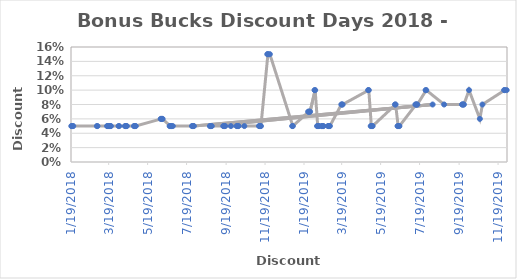
| Category | Discount |
|---|---|
| 12/2/19 | 0.1 |
| 11/29/19 | 0.1 |
| 11/28/19 | 0.1 |
| 10/25/19 | 0.08 |
| 10/21/19 | 0.06 |
| 10/4/19 | 0.1 |
| 9/26/19 | 0.08 |
| 9/25/19 | 0.08 |
| 9/24/19 | 0.08 |
| 9/23/19 | 0.08 |
| 8/26/19 | 0.08 |
| 7/29/19 | 0.1 |
| 7/28/19 | 0.1 |
| 7/15/19 | 0.08 |
| 7/14/19 | 0.08 |
| 7/13/19 | 0.08 |
| 7/12/19 | 0.08 |
| 6/17/19 | 0.05 |
| 6/16/19 | 0.05 |
| 6/15/19 | 0.05 |
| 6/14/19 | 0.05 |
| 6/11/19 | 0.08 |
| 6/10/19 | 0.08 |
| 5/6/19 | 0.05 |
| 5/5/19 | 0.05 |
| 5/4/19 | 0.05 |
| 5/3/19 | 0.05 |
| 4/30/19 | 0.1 |
| 4/29/19 | 0.1 |
| 3/20/19 | 0.08 |
| 3/19/19 | 0.08 |
| 3/18/19 | 0.08 |
| 2/28/19 | 0.05 |
| 2/27/19 | 0.05 |
| 2/26/19 | 0.05 |
| 2/25/19 | 0.05 |
| 2/18/19 | 0.05 |
| 2/17/19 | 0.05 |
| 2/16/19 | 0.05 |
| 2/15/19 | 0.05 |
| 2/11/19 | 0.05 |
| 2/10/19 | 0.05 |
| 2/9/19 | 0.05 |
| 2/8/19 | 0.05 |
| 2/5/19 | 0.1 |
| 2/4/19 | 0.1 |
| 1/28/19 | 0.07 |
| 1/27/19 | 0.07 |
| 1/26/19 | 0.07 |
| 1/25/19 | 0.07 |
| 1/1/19 | 0.05 |
| 12/31/18 | 0.05 |
| 11/26/18 | 0.15 |
| 11/23/18 | 0.15 |
| 11/22/18 | 0.15 |
| 11/12/18 | 0.05 |
| 11/11/18 | 0.05 |
| 11/10/18 | 0.05 |
| 11/9/18 | 0.05 |
| 10/17/18 | 0.05 |
| 10/8/18 | 0.05 |
| 10/7/18 | 0.05 |
| 10/6/18 | 0.05 |
| 10/5/18 | 0.05 |
| 9/26/18 | 0.05 |
| 9/17/18 | 0.05 |
| 9/16/18 | 0.05 |
| 9/15/18 | 0.05 |
| 9/14/18 | 0.05 |
| 8/27/18 | 0.05 |
| 8/26/18 | 0.05 |
| 8/25/18 | 0.05 |
| 8/24/18 | 0.05 |
| 8/8/19 | 0.08 |
| 7/30/18 | 0.05 |
| 7/29/18 | 0.05 |
| 7/28/18 | 0.05 |
| 7/27/18 | 0.05 |
| 6/27/18 | 0.05 |
| 6/25/18 | 0.05 |
| 6/24/18 | 0.05 |
| 6/23/18 | 0.05 |
| 6/22/18 | 0.05 |
| 6/11/18 | 0.06 |
| 6/10/18 | 0.06 |
| 6/9/18 | 0.06 |
| 6/8/18 | 0.06 |
| 4/30/18 | 0.05 |
| 4/29/18 | 0.05 |
| 4/28/18 | 0.05 |
| 4/27/18 | 0.05 |
| 4/16/18 | 0.05 |
| 4/15/18 | 0.05 |
| 4/14/18 | 0.05 |
| 4/13/18 | 0.05 |
| 4/4/18 | 0.05 |
| 4/3/18 | 0.05 |
| 3/22/18 | 0.05 |
| 3/21/18 | 0.05 |
| 3/20/18 | 0.05 |
| 3/19/18 | 0.05 |
| 3/18/18 | 0.05 |
| 3/17/18 | 0.05 |
| 3/16/18 | 0.05 |
| 3/1/18 | 0.05 |
| 2/28/18 | 0.05 |
| 1/22/18 | 0.05 |
| 1/21/18 | 0.05 |
| 1/20/18 | 0.05 |
| 1/19/18 | 0.05 |